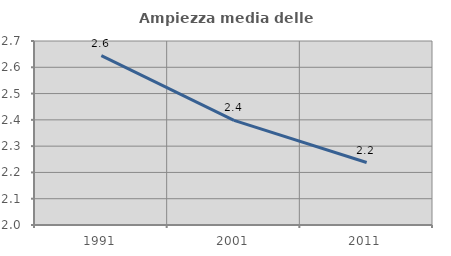
| Category | Ampiezza media delle famiglie |
|---|---|
| 1991.0 | 2.644 |
| 2001.0 | 2.398 |
| 2011.0 | 2.238 |